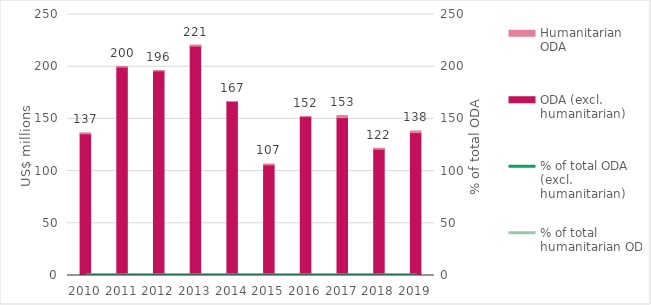
| Category | ODA (excl. humanitarian) | Humanitarian ODA |
|---|---|---|
| 2010.0 | 135.78 | 0.817 |
| 2011.0 | 199.606 | 0.339 |
| 2012.0 | 195.993 | 0.165 |
| 2013.0 | 219.728 | 1.02 |
| 2014.0 | 166.623 | 0.058 |
| 2015.0 | 105.977 | 0.825 |
| 2016.0 | 152.177 | 0.123 |
| 2017.0 | 151.289 | 1.961 |
| 2018.0 | 120.972 | 0.929 |
| 2019.0 | 136.872 | 1.588 |